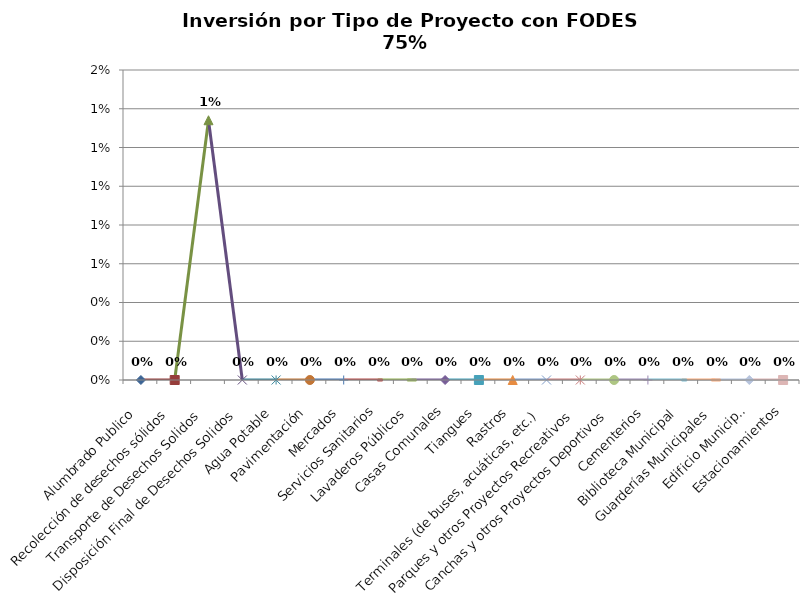
| Category | Series 0 |
|---|---|
| Alumbrado Publico | 0 |
| Recolección de desechos sólidos | 0 |
| Transporte de Desechos Solidos | 0.013 |
| Disposición Final de Desechos Solidos | 0 |
| Agua Potable | 0 |
| Pavimentación | 0 |
| Mercados | 0 |
| Servicios Sanitarios | 0 |
| Lavaderos Públicos | 0 |
| Casas Comunales | 0 |
| Tiangues | 0 |
| Rastros | 0 |
| Terminales (de buses, acuáticas, etc.) | 0 |
| Parques y otros Proyectos Recreativos | 0 |
| Canchas y otros Proyectos Deportivos | 0 |
| Cementerios | 0 |
| Biblioteca Municipal | 0 |
| Guarderías Municipales | 0 |
| Edificio Municipal | 0 |
| Estacionamientos | 0 |